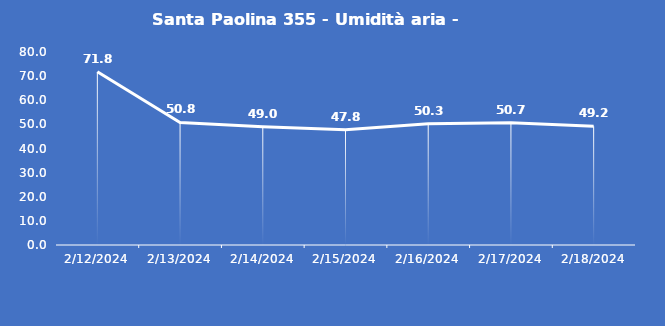
| Category | Santa Paolina 355 - Umidità aria - Grezzo (%) |
|---|---|
| 2/12/24 | 71.8 |
| 2/13/24 | 50.8 |
| 2/14/24 | 49 |
| 2/15/24 | 47.8 |
| 2/16/24 | 50.3 |
| 2/17/24 | 50.7 |
| 2/18/24 | 49.2 |